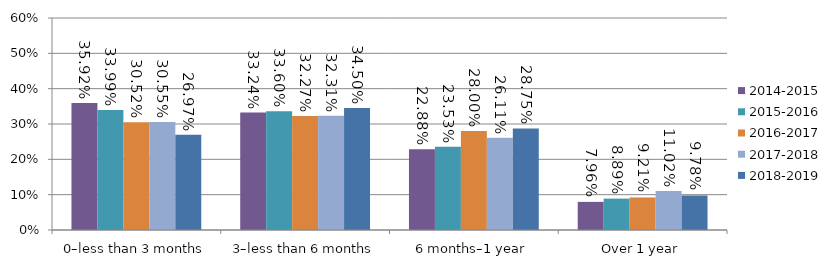
| Category | 2014-2015 | 2015-2016 | 2016-2017 | 2017-2018 | 2018-2019 |
|---|---|---|---|---|---|
| 0–less than 3 months | 0.359 | 0.34 | 0.305 | 0.306 | 0.27 |
| 3–less than 6 months | 0.332 | 0.336 | 0.323 | 0.323 | 0.345 |
| 6 months–1 year | 0.229 | 0.235 | 0.28 | 0.261 | 0.288 |
| Over 1 year | 0.08 | 0.089 | 0.092 | 0.11 | 0.098 |